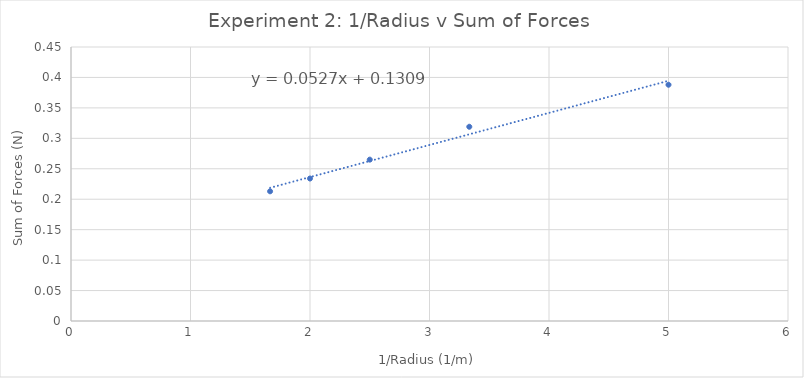
| Category | Sum of forces [ƩF] (N) |
|---|---|
| 1.666 | 0.213 |
| 2.0 | 0.234 |
| 2.5 | 0.265 |
| 3.333 | 0.319 |
| 5.0 | 0.388 |